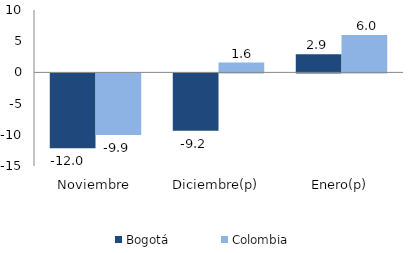
| Category | Bogotá | Colombia |
|---|---|---|
| Noviembre | -11.989 | -9.862 |
| Diciembre(p) | -9.203 | 1.586 |
| Enero(p) | 2.916 | 5.981 |